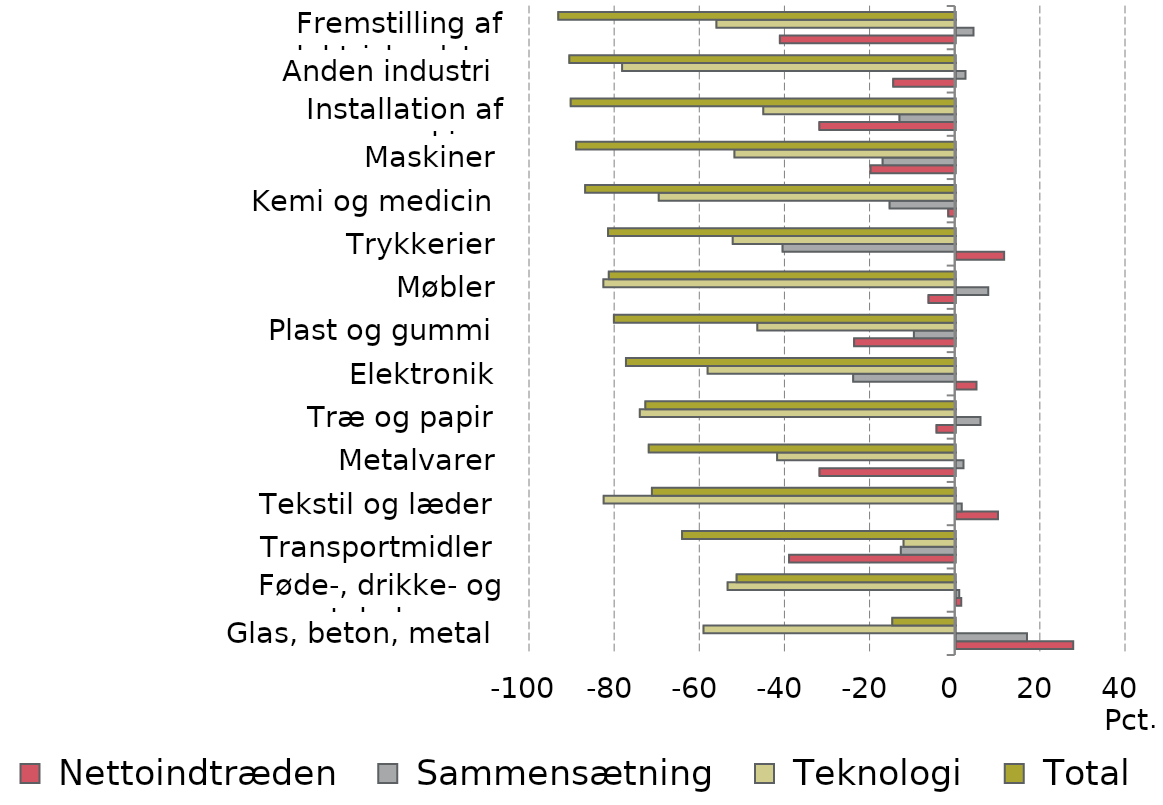
| Category |  Nettoindtræden |  Sammensætning |  Teknologi |  Total |
|---|---|---|---|---|
| Glas, beton, metal | 27.6 | 16.739 | -59.242 | -14.903 |
| Føde-, drikke- og tobaksvarer | 1.307 | 0.817 | -53.583 | -51.46 |
| Transportmidler | -39.142 | -12.888 | -12.249 | -64.28 |
| Tekstil og læder | 9.928 | 1.409 | -82.699 | -71.362 |
| Metalvarer | -31.985 | 1.836 | -41.955 | -72.104 |
| Træ og papir | -4.494 | 5.798 | -74.207 | -72.902 |
| Elektronik | 4.907 | -24.087 | -58.278 | -77.458 |
| Plast og gummi | -23.868 | -9.819 | -46.602 | -80.289 |
| Møbler | -6.384 | 7.661 | -82.766 | -81.488 |
| Trykkerier | 11.378 | -40.667 | -52.38 | -81.669 |
| Kemi og medicin | -1.761 | -15.529 | -69.761 | -87.05 |
| Maskiner | -20.01 | -17.165 | -51.977 | -89.15 |
| Installation af maskiner | -32.024 | -13.209 | -45.202 | -90.436 |
| Anden industri | -14.678 | 2.28 | -78.363 | -90.761 |
| Fremstilling af elektrisk udstyr | -41.303 | 4.154 | -56.21 | -93.358 |